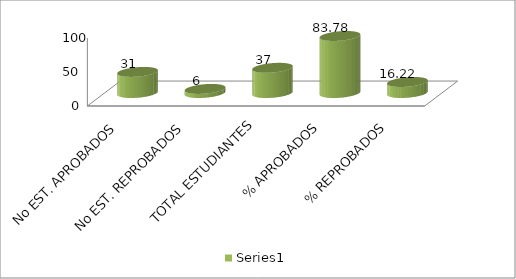
| Category | Series 0 |
|---|---|
| No EST. APROBADOS | 31 |
| No EST. REPROBADOS | 6 |
| TOTAL ESTUDIANTES | 37 |
| % APROBADOS | 83.784 |
| % REPROBADOS | 16.216 |